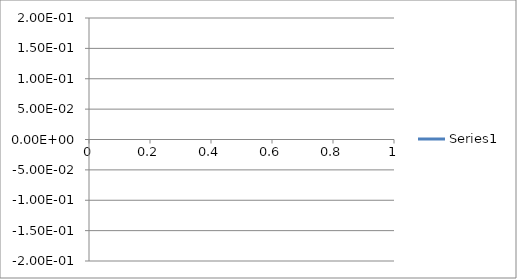
| Category | Series 0 |
|---|---|
| 0 | 0 |
| 1 | 0 |
| 2 | 0 |
| 3 | 0 |
| 4 | 0 |
| 5 | 0 |
| 6 | 0 |
| 7 | 0 |
| 8 | 0 |
| 9 | 0 |
| 10 | 0 |
| 11 | 0 |
| 12 | 0 |
| 13 | 0 |
| 14 | 0 |
| 15 | 0 |
| 16 | 0 |
| 17 | 0 |
| 18 | 0 |
| 19 | 0 |
| 20 | 0 |
| 21 | 0 |
| 22 | 0 |
| 23 | 0 |
| 24 | 0 |
| 25 | 0 |
| 26 | 0 |
| 27 | 0 |
| 28 | 0 |
| 29 | 0 |
| 30 | 0 |
| 31 | 0 |
| 32 | 0.002 |
| 33 | 0.003 |
| 34 | 0 |
| 35 | -0.008 |
| 36 | -0.018 |
| 37 | -0.033 |
| 38 | -0.064 |
| 39 | -0.109 |
| 40 | -0.144 |
| 41 | -0.134 |
| 42 | -0.071 |
| 43 | 0.009 |
| 44 | 0.057 |
| 45 | 0.051 |
| 46 | 0.004 |
| 47 | -0.053 |
| 48 | -0.1 |
| 49 | -0.129 |
| 50 | -0.137 |
| 51 | -0.125 |
| 52 | -0.098 |
| 53 | -0.062 |
| 54 | -0.021 |
| 55 | 0.024 |
| 56 | 0.07 |
| 57 | 0.111 |
| 58 | 0.139 |
| 59 | 0.151 |
| 60 | 0.146 |
| 61 | 0.135 |
| 62 | 0.123 |
| 63 | 0.115 |
| 64 | 0.107 |
| 65 | 0.095 |
| 66 | 0.077 |
| 67 | 0.057 |
| 68 | 0.038 |
| 69 | 0.021 |
| 70 | 0.008 |
| 71 | -0.001 |
| 72 | -0.008 |
| 73 | -0.012 |
| 74 | -0.015 |
| 75 | -0.016 |
| 76 | -0.016 |
| 77 | -0.016 |
| 78 | -0.016 |
| 79 | -0.016 |
| 80 | -0.016 |
| 81 | -0.016 |
| 82 | -0.016 |
| 83 | -0.016 |
| 84 | -0.016 |
| 85 | -0.016 |
| 86 | -0.016 |
| 87 | -0.016 |
| 88 | -0.016 |
| 89 | -0.016 |
| 90 | -0.016 |
| 91 | -0.016 |
| 92 | -0.016 |
| 93 | -0.016 |
| 94 | -0.016 |
| 95 | -0.016 |
| 96 | -0.016 |
| 97 | -0.016 |
| 98 | -0.016 |
| 99 | -0.016 |
| 100 | -0.016 |
| 101 | -0.016 |
| 102 | -0.016 |
| 103 | -0.016 |
| 104 | -0.016 |
| 105 | -0.016 |
| 106 | -0.016 |
| 107 | -0.016 |
| 108 | -0.016 |
| 109 | -0.016 |
| 110 | -0.016 |
| 111 | -0.016 |
| 112 | -0.016 |
| 113 | -0.016 |
| 114 | -0.016 |
| 115 | -0.016 |
| 116 | -0.016 |
| 117 | -0.016 |
| 118 | -0.016 |
| 119 | -0.016 |
| 120 | -0.016 |
| 121 | -0.016 |
| 122 | -0.016 |
| 123 | -0.016 |
| 124 | -0.016 |
| 125 | -0.016 |
| 126 | -0.016 |
| 127 | -0.016 |
| 128 | -0.016 |
| 129 | -0.016 |
| 130 | -0.016 |
| 131 | -0.016 |
| 132 | -0.016 |
| 133 | -0.016 |
| 134 | -0.016 |
| 135 | -0.016 |
| 136 | -0.016 |
| 137 | -0.016 |
| 138 | -0.016 |
| 139 | -0.016 |
| 140 | -0.016 |
| 141 | -0.016 |
| 142 | -0.016 |
| 143 | -0.016 |
| 144 | -0.016 |
| 145 | -0.016 |
| 146 | -0.016 |
| 147 | -0.016 |
| 148 | -0.016 |
| 149 | -0.016 |
| 150 | -0.016 |
| 151 | -0.016 |
| 152 | -0.016 |
| 153 | -0.016 |
| 154 | -0.016 |
| 155 | -0.016 |
| 156 | -0.016 |
| 157 | -0.016 |
| 158 | -0.016 |
| 159 | -0.016 |
| 160 | -0.016 |
| 161 | -0.016 |
| 162 | -0.016 |
| 163 | -0.016 |
| 164 | -0.016 |
| 165 | -0.016 |
| 166 | -0.016 |
| 167 | -0.016 |
| 168 | -0.016 |
| 169 | -0.016 |
| 170 | -0.016 |
| 171 | -0.016 |
| 172 | -0.016 |
| 173 | -0.016 |
| 174 | -0.016 |
| 175 | -0.016 |
| 176 | -0.016 |
| 177 | -0.016 |
| 178 | -0.016 |
| 179 | -0.016 |
| 180 | -0.016 |
| 181 | -0.016 |
| 182 | -0.016 |
| 183 | -0.016 |
| 184 | -0.016 |
| 185 | -0.016 |
| 186 | -0.016 |
| 187 | -0.016 |
| 188 | -0.016 |
| 189 | -0.016 |
| 190 | -0.016 |
| 191 | -0.016 |
| 192 | -0.016 |
| 193 | -0.016 |
| 194 | -0.016 |
| 195 | -0.016 |
| 196 | -0.016 |
| 197 | -0.016 |
| 198 | -0.016 |
| 199 | -0.016 |
| 200 | -0.016 |
| 201 | -0.016 |
| 202 | -0.016 |
| 203 | -0.016 |
| 204 | -0.016 |
| 205 | -0.016 |
| 206 | -0.016 |
| 207 | -0.016 |
| 208 | -0.016 |
| 209 | -0.016 |
| 210 | -0.016 |
| 211 | -0.016 |
| 212 | -0.016 |
| 213 | -0.016 |
| 214 | -0.016 |
| 215 | -0.016 |
| 216 | -0.016 |
| 217 | -0.016 |
| 218 | -0.016 |
| 219 | -0.016 |
| 220 | -0.016 |
| 221 | -0.016 |
| 222 | -0.016 |
| 223 | -0.016 |
| 224 | -0.016 |
| 225 | -0.016 |
| 226 | -0.016 |
| 227 | -0.016 |
| 228 | -0.016 |
| 229 | -0.016 |
| 230 | -0.016 |
| 231 | -0.016 |
| 232 | -0.016 |
| 233 | -0.016 |
| 234 | -0.016 |
| 235 | -0.016 |
| 236 | -0.016 |
| 237 | -0.016 |
| 238 | -0.016 |
| 239 | -0.016 |
| 240 | -0.016 |
| 241 | -0.016 |
| 242 | -0.016 |
| 243 | -0.016 |
| 244 | -0.016 |
| 245 | -0.016 |
| 246 | -0.016 |
| 247 | -0.016 |
| 248 | -0.016 |
| 249 | -0.016 |
| 250 | -0.016 |
| 251 | -0.016 |
| 252 | -0.016 |
| 253 | -0.016 |
| 254 | -0.016 |
| 255 | -0.016 |
| 256 | -0.016 |
| 257 | -0.016 |
| 258 | -0.016 |
| 259 | -0.016 |
| 260 | -0.016 |
| 261 | -0.016 |
| 262 | -0.016 |
| 263 | -0.016 |
| 264 | -0.016 |
| 265 | -0.016 |
| 266 | -0.016 |
| 267 | -0.016 |
| 268 | -0.016 |
| 269 | -0.016 |
| 270 | -0.016 |
| 271 | -0.016 |
| 272 | -0.016 |
| 273 | -0.016 |
| 274 | -0.016 |
| 275 | -0.016 |
| 276 | -0.016 |
| 277 | -0.016 |
| 278 | -0.016 |
| 279 | -0.016 |
| 280 | -0.016 |
| 281 | -0.016 |
| 282 | -0.016 |
| 283 | -0.016 |
| 284 | -0.016 |
| 285 | -0.016 |
| 286 | -0.016 |
| 287 | -0.016 |
| 288 | -0.016 |
| 289 | -0.016 |
| 290 | -0.016 |
| 291 | -0.016 |
| 292 | -0.016 |
| 293 | -0.016 |
| 294 | -0.016 |
| 295 | -0.016 |
| 296 | -0.016 |
| 297 | -0.016 |
| 298 | -0.016 |
| 299 | -0.016 |
| 300 | -0.016 |
| 301 | -0.016 |
| 302 | -0.016 |
| 303 | -0.016 |
| 304 | -0.016 |
| 305 | -0.016 |
| 306 | -0.016 |
| 307 | -0.016 |
| 308 | -0.016 |
| 309 | -0.016 |
| 310 | -0.016 |
| 311 | -0.016 |
| 312 | -0.016 |
| 313 | -0.016 |
| 314 | -0.016 |
| 315 | -0.016 |
| 316 | -0.016 |
| 317 | -0.016 |
| 318 | -0.016 |
| 319 | -0.016 |
| 320 | -0.016 |
| 321 | -0.016 |
| 322 | -0.016 |
| 323 | -0.016 |
| 324 | -0.016 |
| 325 | -0.016 |
| 326 | -0.016 |
| 327 | -0.016 |
| 328 | -0.016 |
| 329 | -0.016 |
| 330 | -0.016 |
| 331 | -0.016 |
| 332 | -0.016 |
| 333 | -0.016 |
| 334 | -0.016 |
| 335 | -0.016 |
| 336 | -0.016 |
| 337 | -0.016 |
| 338 | -0.016 |
| 339 | -0.016 |
| 340 | -0.016 |
| 341 | -0.016 |
| 342 | -0.016 |
| 343 | -0.016 |
| 344 | -0.016 |
| 345 | -0.016 |
| 346 | -0.016 |
| 347 | -0.016 |
| 348 | -0.016 |
| 349 | -0.016 |
| 350 | -0.016 |
| 351 | -0.016 |
| 352 | -0.016 |
| 353 | -0.016 |
| 354 | -0.016 |
| 355 | -0.016 |
| 356 | -0.016 |
| 357 | -0.016 |
| 358 | -0.016 |
| 359 | -0.016 |
| 360 | -0.016 |
| 361 | -0.016 |
| 362 | -0.016 |
| 363 | -0.016 |
| 364 | -0.016 |
| 365 | -0.016 |
| 366 | -0.016 |
| 367 | -0.016 |
| 368 | -0.016 |
| 369 | -0.016 |
| 370 | -0.016 |
| 371 | -0.016 |
| 372 | -0.016 |
| 373 | -0.016 |
| 374 | -0.016 |
| 375 | -0.016 |
| 376 | -0.016 |
| 377 | -0.016 |
| 378 | -0.016 |
| 379 | -0.016 |
| 380 | -0.016 |
| 381 | -0.016 |
| 382 | -0.016 |
| 383 | -0.016 |
| 384 | -0.016 |
| 385 | -0.016 |
| 386 | -0.016 |
| 387 | -0.016 |
| 388 | -0.016 |
| 389 | -0.016 |
| 390 | -0.016 |
| 391 | -0.016 |
| 392 | -0.016 |
| 393 | -0.016 |
| 394 | -0.016 |
| 395 | -0.016 |
| 396 | -0.016 |
| 397 | -0.016 |
| 398 | -0.016 |
| 399 | -0.016 |
| 400 | -0.016 |